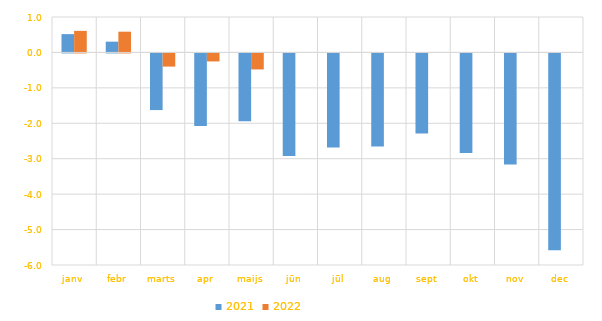
| Category | 2021 | 2022 |
|---|---|---|
| janv | 0.517 | 0.608 |
| febr | 0.304 | 0.586 |
| marts | -1.599 | -0.372 |
| apr | -2.048 | -0.226 |
| maijs | -1.915 | -0.452 |
| jūn | -2.897 | 0 |
| jūl | -2.652 | 0 |
| aug | -2.627 | 0 |
| sept | -2.261 | 0 |
| okt | -2.809 | 0 |
| nov | -3.135 | 0 |
| dec | -5.554 | 0 |